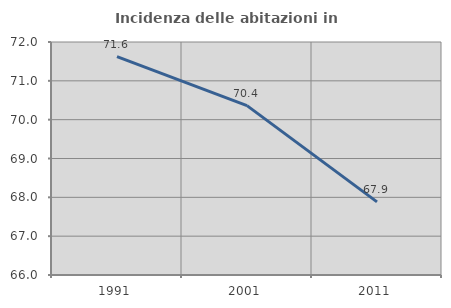
| Category | Incidenza delle abitazioni in proprietà  |
|---|---|
| 1991.0 | 71.623 |
| 2001.0 | 70.361 |
| 2011.0 | 67.882 |